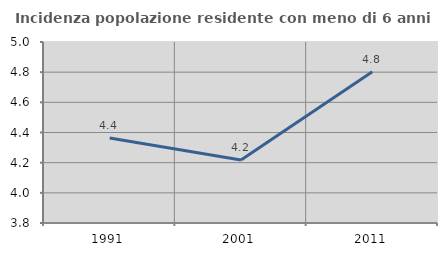
| Category | Incidenza popolazione residente con meno di 6 anni |
|---|---|
| 1991.0 | 4.364 |
| 2001.0 | 4.218 |
| 2011.0 | 4.803 |